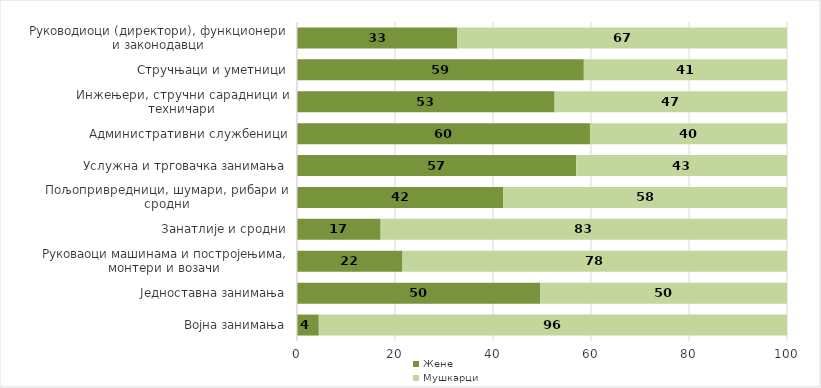
| Category | Жене | Мушкарци |
|---|---|---|
| Војна занимања | 4.449 | 95.551 |
| Једноставна занимања | 49.667 | 50.333 |
| Руковаоци машинама и постројењима, монтери и возачи | 21.529 | 78.471 |
| Занатлије и сродни | 17.066 | 82.934 |
| Пољопривредници, шумари, рибари и сродни | 42.053 | 57.947 |
| Услужна и трговачка занимања | 57.002 | 42.998 |
| Административни службеници | 59.791 | 40.209 |
| Инжењери, стручни сарадници и техничари | 52.566 | 47.434 |
| Стручњаци и уметници | 58.536 | 41.464 |
| Руководиоци (директори), функционери и законодавци | 32.738 | 67.262 |